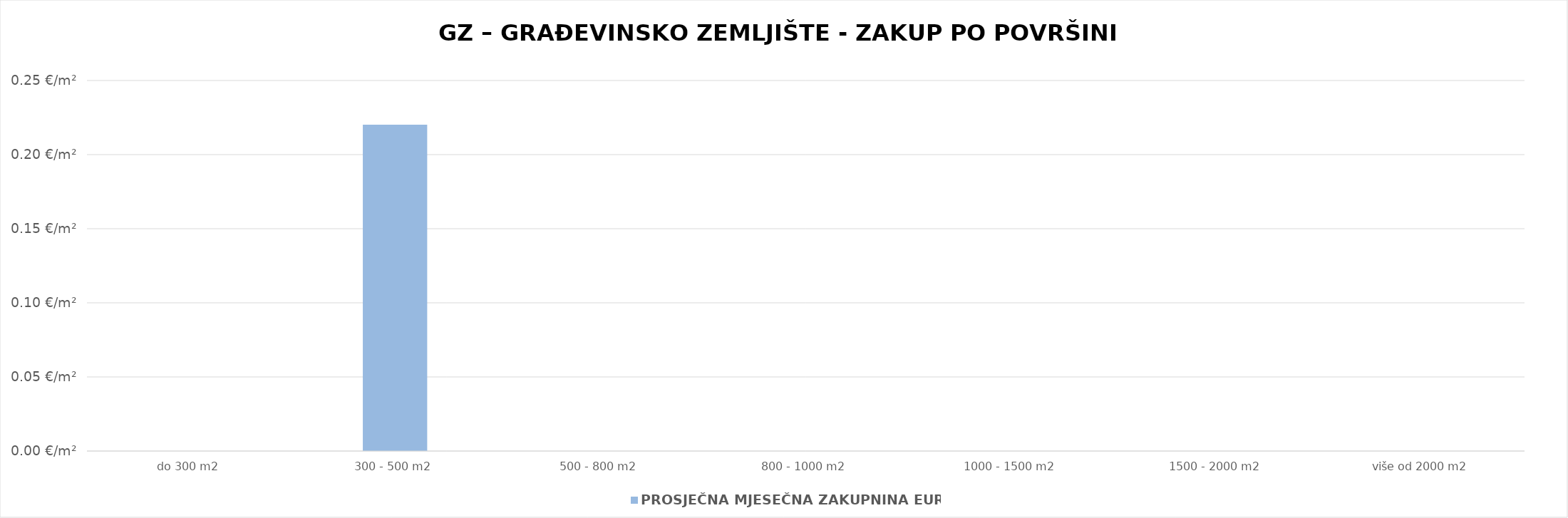
| Category | PROSJEČNA MJESEČNA ZAKUPNINA EUR/m2 |
|---|---|
| do 300 m2 | 0 |
| 300 - 500 m2 | 0.22 |
| 500 - 800 m2 | 0 |
| 800 - 1000 m2 | 0 |
| 1000 - 1500 m2 | 0 |
| 1500 - 2000 m2 | 0 |
| više od 2000 m2 | 0 |